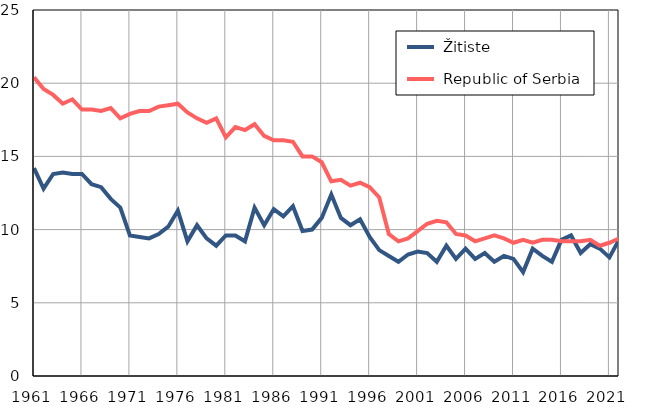
| Category |  Žitiste |  Republic of Serbia |
|---|---|---|
| 1961.0 | 14.2 | 20.4 |
| 1962.0 | 12.8 | 19.6 |
| 1963.0 | 13.8 | 19.2 |
| 1964.0 | 13.9 | 18.6 |
| 1965.0 | 13.8 | 18.9 |
| 1966.0 | 13.8 | 18.2 |
| 1967.0 | 13.1 | 18.2 |
| 1968.0 | 12.9 | 18.1 |
| 1969.0 | 12.1 | 18.3 |
| 1970.0 | 11.5 | 17.6 |
| 1971.0 | 9.6 | 17.9 |
| 1972.0 | 9.5 | 18.1 |
| 1973.0 | 9.4 | 18.1 |
| 1974.0 | 9.7 | 18.4 |
| 1975.0 | 10.2 | 18.5 |
| 1976.0 | 11.3 | 18.6 |
| 1977.0 | 9.2 | 18 |
| 1978.0 | 10.3 | 17.6 |
| 1979.0 | 9.4 | 17.3 |
| 1980.0 | 8.9 | 17.6 |
| 1981.0 | 9.6 | 16.3 |
| 1982.0 | 9.6 | 17 |
| 1983.0 | 9.2 | 16.8 |
| 1984.0 | 11.5 | 17.2 |
| 1985.0 | 10.3 | 16.4 |
| 1986.0 | 11.4 | 16.1 |
| 1987.0 | 10.9 | 16.1 |
| 1988.0 | 11.6 | 16 |
| 1989.0 | 9.9 | 15 |
| 1990.0 | 10 | 15 |
| 1991.0 | 10.8 | 14.6 |
| 1992.0 | 12.4 | 13.3 |
| 1993.0 | 10.8 | 13.4 |
| 1994.0 | 10.3 | 13 |
| 1995.0 | 10.7 | 13.2 |
| 1996.0 | 9.5 | 12.9 |
| 1997.0 | 8.6 | 12.2 |
| 1998.0 | 8.2 | 9.7 |
| 1999.0 | 7.8 | 9.2 |
| 2000.0 | 8.3 | 9.4 |
| 2001.0 | 8.5 | 9.9 |
| 2002.0 | 8.4 | 10.4 |
| 2003.0 | 7.8 | 10.6 |
| 2004.0 | 8.9 | 10.5 |
| 2005.0 | 8 | 9.7 |
| 2006.0 | 8.7 | 9.6 |
| 2007.0 | 8 | 9.2 |
| 2008.0 | 8.4 | 9.4 |
| 2009.0 | 7.8 | 9.6 |
| 2010.0 | 8.2 | 9.4 |
| 2011.0 | 8 | 9.1 |
| 2012.0 | 7.1 | 9.3 |
| 2013.0 | 8.7 | 9.1 |
| 2014.0 | 8.2 | 9.3 |
| 2015.0 | 7.8 | 9.3 |
| 2016.0 | 9.3 | 9.2 |
| 2017.0 | 9.6 | 9.2 |
| 2018.0 | 8.4 | 9.2 |
| 2019.0 | 9 | 9.3 |
| 2020.0 | 8.7 | 8.9 |
| 2021.0 | 8.1 | 9.1 |
| 2022.0 | 9.3 | 9.4 |